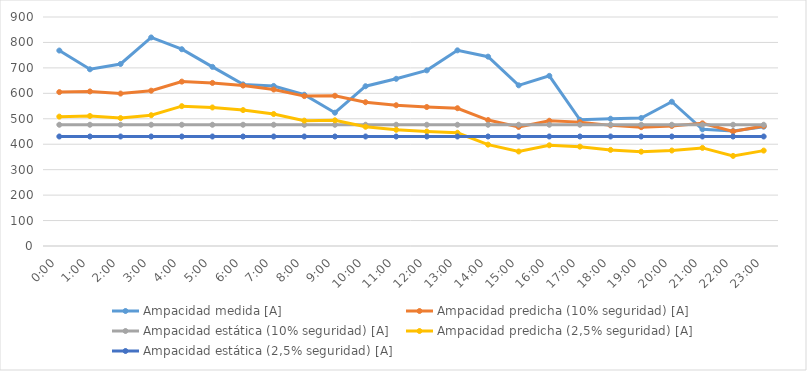
| Category | Ampacidad medida [A] | Ampacidad predicha (10% seguridad) [A] | Ampacidad estática (10% seguridad) [A] | Ampacidad predicha (2,5% seguridad) [A] | Ampacidad estática (2,5% seguridad) [A] |
|---|---|---|---|---|---|
| 0.0 | 768.18 | 604.862 | 476.5 | 508.429 | 430.4 |
| 0.041666666666666664 | 694.479 | 607.46 | 476.5 | 511.026 | 430.4 |
| 0.08333333333333333 | 715.391 | 599.107 | 476.5 | 502.674 | 430.4 |
| 0.125 | 819.546 | 610.376 | 476.5 | 513.943 | 430.4 |
| 0.166666666666667 | 773.365 | 646.027 | 476.5 | 549.593 | 430.4 |
| 0.208333333333333 | 704.008 | 640.933 | 476.5 | 544.499 | 430.4 |
| 0.25 | 635.177 | 630.564 | 476.5 | 534.13 | 430.4 |
| 0.291666666666667 | 629.036 | 615.082 | 476.5 | 518.649 | 430.4 |
| 0.333333333333333 | 594.517 | 589.126 | 476.5 | 492.692 | 430.4 |
| 0.375 | 523.855 | 590.384 | 476.5 | 493.95 | 430.4 |
| 0.416666666666667 | 627.947 | 565.077 | 476.5 | 468.643 | 430.4 |
| 0.458333333333333 | 657.077 | 553.227 | 476.5 | 456.793 | 430.4 |
| 0.5 | 690.291 | 546.241 | 476.5 | 449.807 | 430.4 |
| 0.541666666666667 | 768.94 | 541.45 | 476.5 | 445.016 | 430.4 |
| 0.583333333333333 | 744.123 | 494.865 | 476.5 | 398.432 | 430.4 |
| 0.625 | 631.52 | 467.912 | 476.5 | 371.478 | 430.4 |
| 0.666666666666667 | 668.646 | 492.218 | 476.5 | 395.784 | 430.4 |
| 0.708333333333333 | 495.999 | 486.858 | 476.5 | 390.424 | 430.4 |
| 0.75 | 500.176 | 474.085 | 476.5 | 377.652 | 430.4 |
| 0.791666666666667 | 503.01 | 467.106 | 476.5 | 370.672 | 430.4 |
| 0.833333333333333 | 566.925 | 471.759 | 476.5 | 375.325 | 430.4 |
| 0.875 | 458.54 | 482.01 | 476.5 | 385.577 | 430.4 |
| 0.916666666666667 | 451.831 | 450.563 | 476.5 | 354.13 | 430.4 |
| 0.958333333333333 | 468.901 | 471.333 | 476.5 | 374.899 | 430.4 |